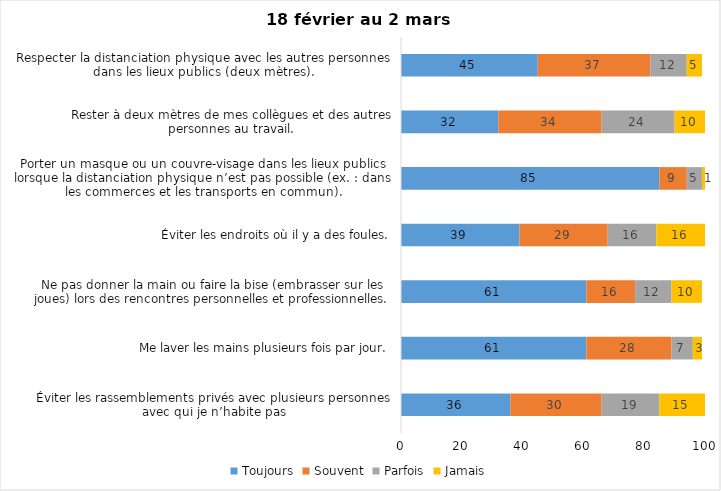
| Category | Toujours | Souvent | Parfois | Jamais |
|---|---|---|---|---|
| Éviter les rassemblements privés avec plusieurs personnes avec qui je n’habite pas | 36 | 30 | 19 | 15 |
| Me laver les mains plusieurs fois par jour. | 61 | 28 | 7 | 3 |
| Ne pas donner la main ou faire la bise (embrasser sur les joues) lors des rencontres personnelles et professionnelles. | 61 | 16 | 12 | 10 |
| Éviter les endroits où il y a des foules. | 39 | 29 | 16 | 16 |
| Porter un masque ou un couvre-visage dans les lieux publics lorsque la distanciation physique n’est pas possible (ex. : dans les commerces et les transports en commun). | 85 | 9 | 5 | 1 |
| Rester à deux mètres de mes collègues et des autres personnes au travail. | 32 | 34 | 24 | 10 |
| Respecter la distanciation physique avec les autres personnes dans les lieux publics (deux mètres). | 45 | 37 | 12 | 5 |